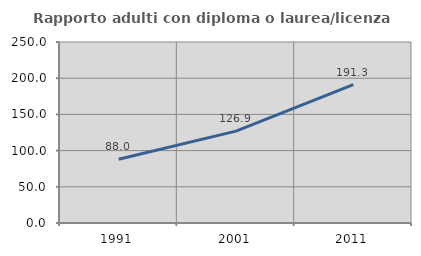
| Category | Rapporto adulti con diploma o laurea/licenza media  |
|---|---|
| 1991.0 | 87.963 |
| 2001.0 | 126.91 |
| 2011.0 | 191.252 |